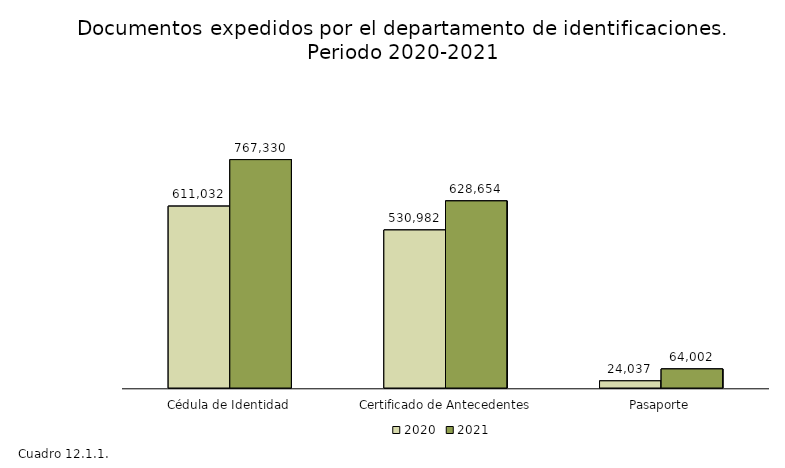
| Category | 2020 | 2021 |
|---|---|---|
| Cédula de Identidad | 611032 | 767330 |
| Certificado de Antecedentes | 530982 | 628654 |
| Pasaporte | 24037 | 64002 |